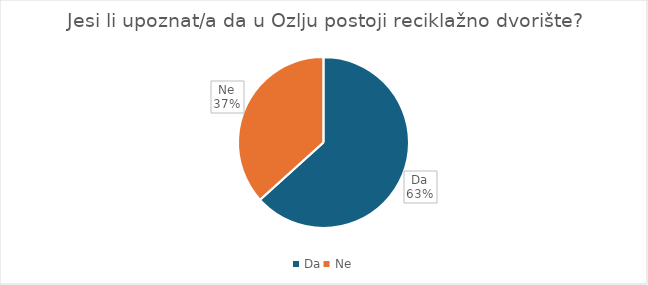
| Category | Series 0 |
|---|---|
| Da | 69 |
| Ne | 40 |